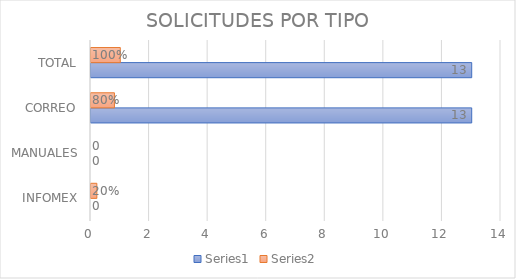
| Category | Series 0 | Series 1 |
|---|---|---|
| INFOMEX | 0 | 0.2 |
| MANUALES | 0 | 0 |
| CORREO | 13 | 0.8 |
| TOTAL | 13 | 1 |